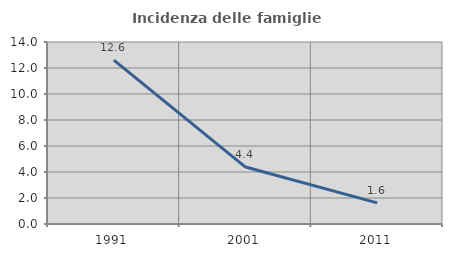
| Category | Incidenza delle famiglie numerose |
|---|---|
| 1991.0 | 12.607 |
| 2001.0 | 4.381 |
| 2011.0 | 1.628 |